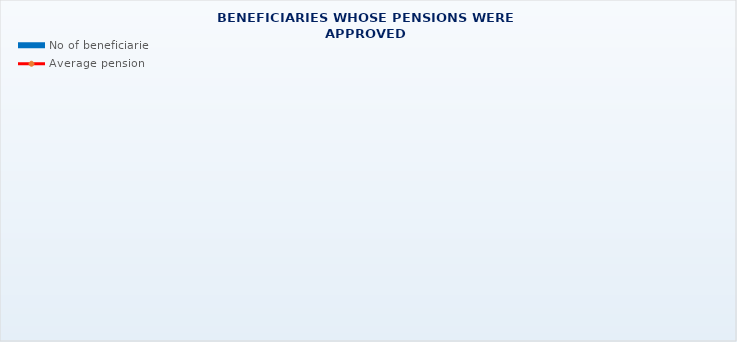
| Category | No of beneficiaries |
|---|---|
| Authorised officials in internal affairs, judicial officers and workers engaged in demining work: | 17264 |
| Pension beneficiaries entitled under the Fire Services Act (Official Gazette 125/19)* | 68 |
| Active military personnel - DVO  | 15866 |
| Croatian Homeland Army veterans mobilised from 1941 to 1945 | 3345 |
| Former political prisoners | 2623 |
| Croatian Veterans from the Homeland War - ZOHBDR (Act on Croatian Homeland War Veterans and Their Family Members) | 71031 |
| Pensions approved under general regulations and determined according to the Act on the Rights of Croatian Homeland War Veterans and their Family Members (ZOHBDR), in 2017 (Art. 27, 35, 48 and 49, paragraph 2)    | 46832 |
| Former Yugoslav People's Army members - JNA   | 4924 |
| Former Yugoslav People's Army members - JNA - Art. 185 of Pension Insurance Act (ZOMO)  | 159 |
| National Liberation War veterans - NOR | 8164 |
| Members of the Croatian Parliament, members of the Government, judges of the Constitutional Court and the Auditor General | 682 |
| Members of the Parliamentary Executive Council and administratively retired federal civil servants  (relates to the former SFRY) | 87 |
| Former officials of federal bodies o the former SFRJ -  Article 38 of the Pension Insurance Act (ZOMO) | 31 |
| Full members of the Croatian Academy of Sciences and Arts - HAZU | 137 |
| Miners from the Istrian coal mines "Tupljak" d.d. Labin  | 251 |
| Workers professionally exposed to asbestos | 861 |
| Insurees - crew members on a ship in international and national navigation  - Article  129, paragraph 2 of the Maritime Code | 191 |
| Members of the Croatian Defence Council - HVO  | 6778 |